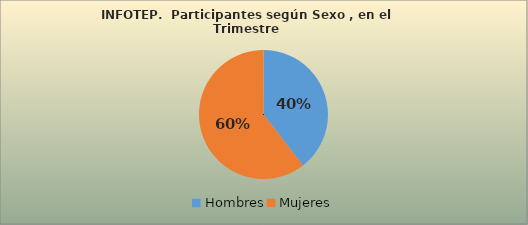
| Category | Series 0 |
|---|---|
| Hombres | 82741 |
| Mujeres | 126718 |